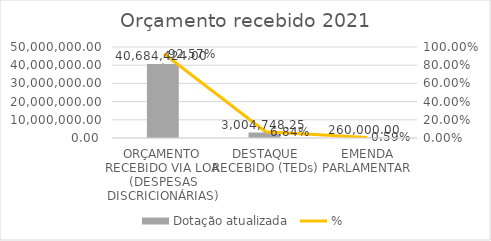
| Category | Dotação atualizada |
|---|---|
| ORÇAMENTO RECEBIDO VIA LOA (DESPESAS DISCRICIONÁRIAS) | 40684424 |
| DESTAQUE RECEBIDO (TEDs) | 3004748.25 |
| EMENDA PARLAMENTAR | 260000 |